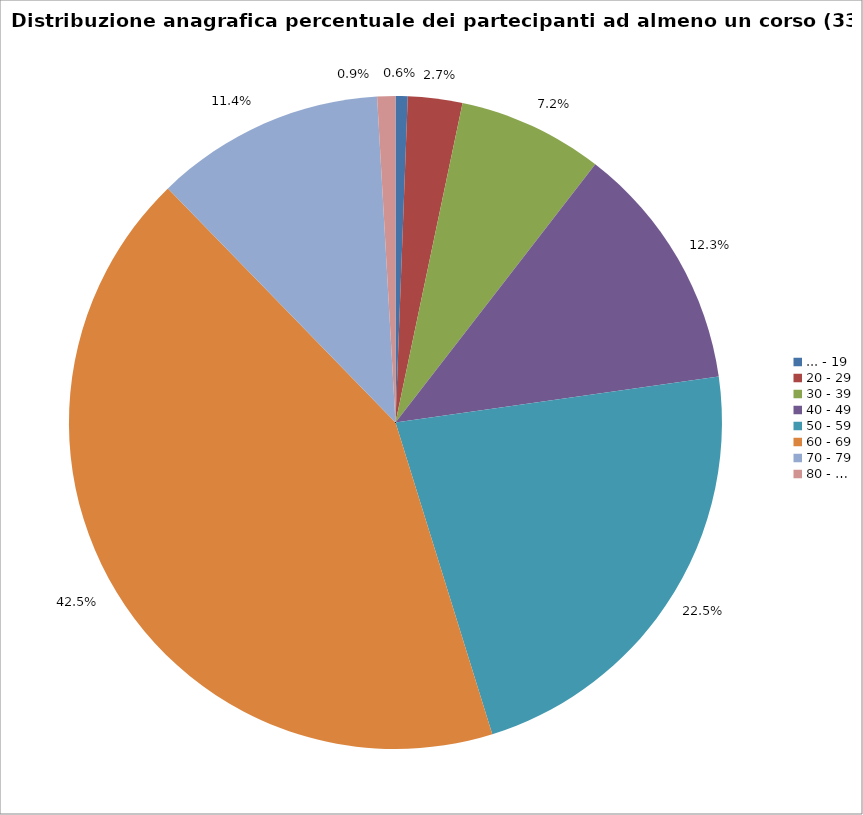
| Category | Nr. Tesserati |
|---|---|
| ... - 19 | 2 |
| 20 - 29 | 9 |
| 30 - 39 | 24 |
| 40 - 49 | 41 |
| 50 - 59 | 75 |
| 60 - 69 | 142 |
| 70 - 79 | 38 |
| 80 - … | 3 |